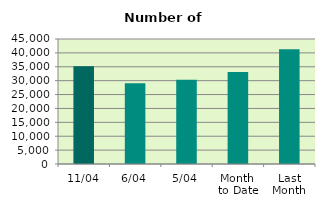
| Category | Series 0 |
|---|---|
| 11/04 | 35214 |
| 6/04 | 29082 |
| 5/04 | 30344 |
| Month 
to Date | 33107.2 |
| Last
Month | 41301.217 |